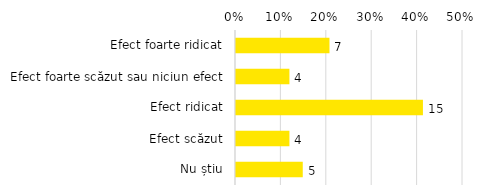
| Category | Total |
|---|---|
| Efect foarte ridicat | 0.206 |
| Efect foarte scăzut sau niciun efect | 0.118 |
| Efect ridicat | 0.412 |
| Efect scăzut | 0.118 |
| Nu știu | 0.147 |